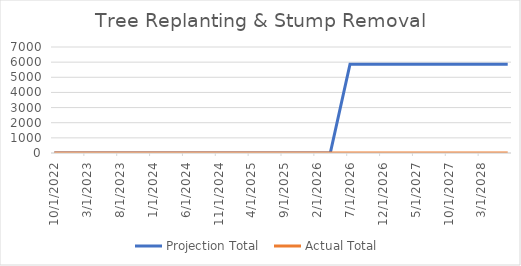
| Category | Projection Total  | Actual Total  |
|---|---|---|
| 10/1/22 | 0 | 0 |
| 1/1/23 | 0 | 0 |
| 4/1/23 | 0 | 0 |
| 7/1/23 | 0 | 0 |
| 10/1/23 | 0 | 0 |
| 1/1/24 | 0 | 0 |
| 4/1/24 | 0 | 0 |
| 7/1/24 | 0 | 0 |
| 10/1/24 | 0 | 0 |
| 1/1/25 | 0 | 0 |
| 4/1/25 | 0 | 0 |
| 7/1/25 | 0 | 0 |
| 10/1/25 | 0 | 0 |
| 1/1/26 | 0 | 0 |
| 4/1/26 | 0 | 0 |
| 7/1/26 | 5867 | 0 |
| 10/1/26 | 5867 | 0 |
| 1/1/27 | 5867 | 0 |
| 4/1/27 | 5867 | 0 |
| 7/1/27 | 5867 | 0 |
| 10/1/27 | 5867 | 0 |
| 1/1/28 | 5867 | 0 |
| 4/1/28 | 5867 | 0 |
| 7/1/28 | 5867 | 0 |